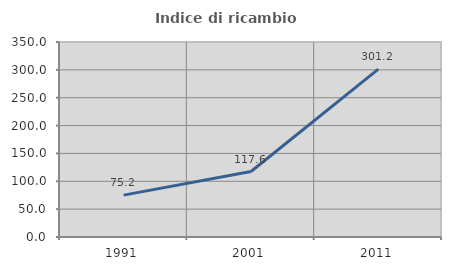
| Category | Indice di ricambio occupazionale  |
|---|---|
| 1991.0 | 75.155 |
| 2001.0 | 117.557 |
| 2011.0 | 301.22 |